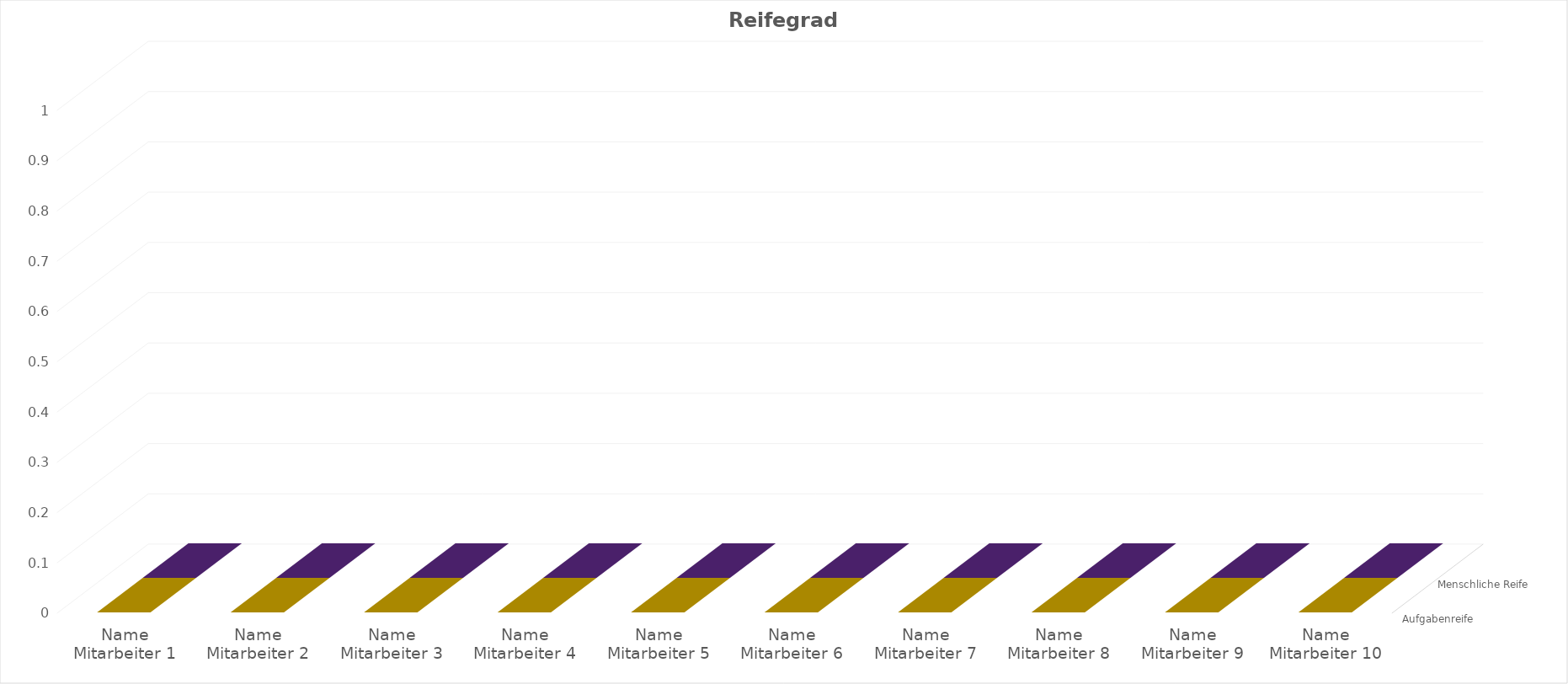
| Category | Aufgabenreife | Menschliche Reife |
|---|---|---|
| Name Mitarbeiter 1 | 0 | 0 |
| Name Mitarbeiter 2 | 0 | 0 |
| Name Mitarbeiter 3 | 0 | 0 |
| Name Mitarbeiter 4 | 0 | 0 |
| Name Mitarbeiter 5 | 0 | 0 |
| Name Mitarbeiter 6 | 0 | 0 |
| Name Mitarbeiter 7 | 0 | 0 |
| Name Mitarbeiter 8 | 0 | 0 |
| Name Mitarbeiter 9 | 0 | 0 |
| Name Mitarbeiter 10 | 0 | 0 |